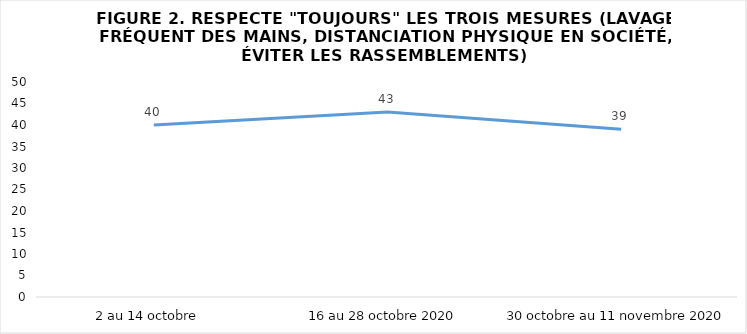
| Category | Series 0 |
|---|---|
| 2 au 14 octobre  | 40 |
| 16 au 28 octobre 2020 | 43 |
| 30 octobre au 11 novembre 2020 | 39 |